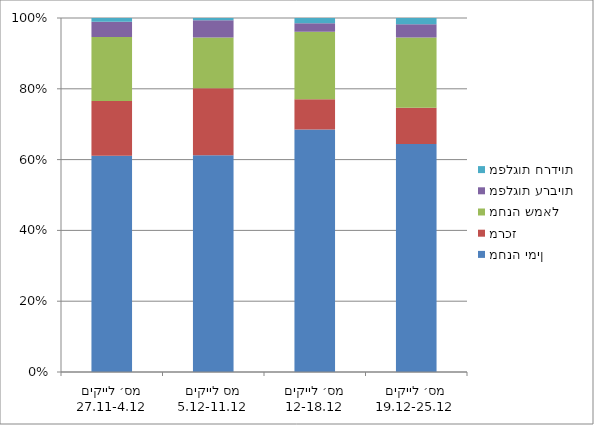
| Category | מחנה ימין | מרכז | מחנה שמאל | מפלגות ערביות | מפלגות חרדיות |
|---|---|---|---|---|---|
| מס׳ לייקים 27.11-4.12 | 416436 | 105533 | 123269 | 29429 | 7052 |
| מס לייקים 5.12-11.12 | 378251 | 116707 | 88622 | 30086 | 4026 |
| מס׳ לייקים 12-18.12 | 503488 | 62475 | 140247 | 17548 | 10958 |
| מס׳ לייקים 19.12-25.12 | 486454 | 77141 | 149693 | 28472 | 13357 |